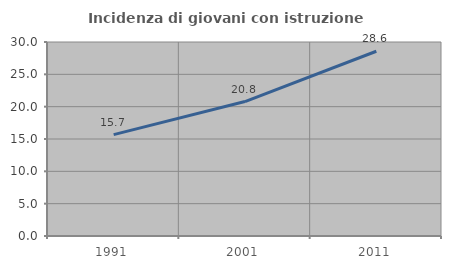
| Category | Incidenza di giovani con istruzione universitaria |
|---|---|
| 1991.0 | 15.68 |
| 2001.0 | 20.793 |
| 2011.0 | 28.571 |